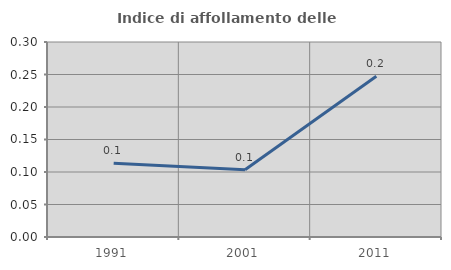
| Category | Indice di affollamento delle abitazioni  |
|---|---|
| 1991.0 | 0.114 |
| 2001.0 | 0.104 |
| 2011.0 | 0.247 |